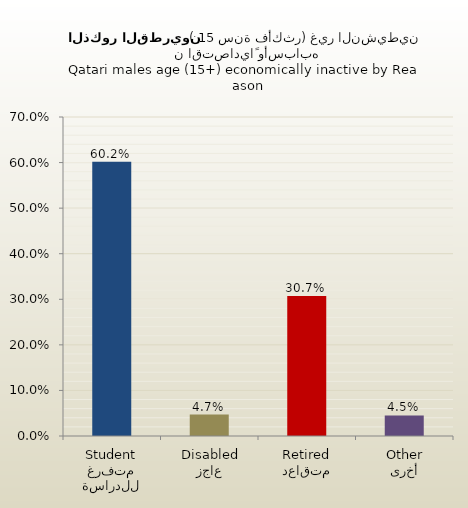
| Category | الذكور القطريين |
|---|---|
| متفرغ للدراسة
Student | 0.602 |
| عاجز
Disabled | 0.047 |
| متقاعد
Retired | 0.307 |
| أخرى
Other | 0.045 |